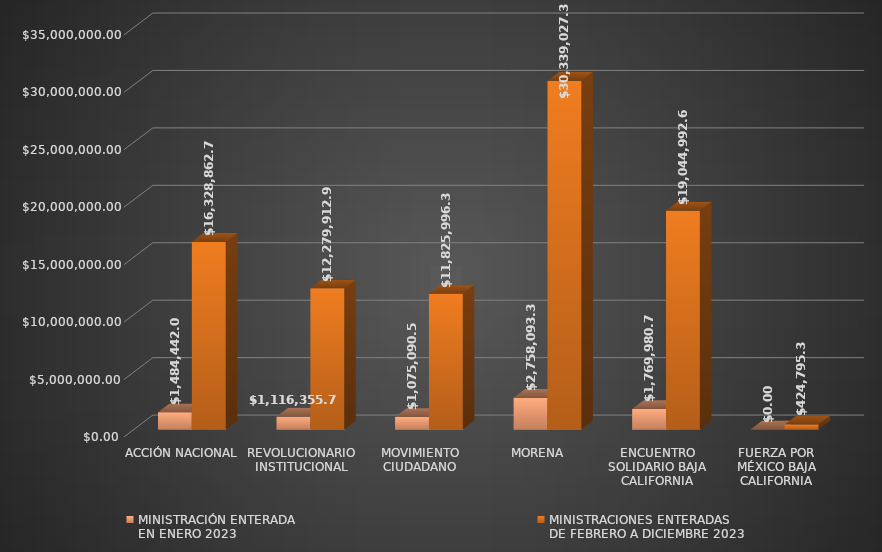
| Category | MINISTRACIÓN ENTERADA
EN ENERO 2023 | MINISTRACIONES ENTERADAS 
DE FEBRERO A DICIEMBRE 2023 |
|---|---|---|
| ACCIÓN NACIONAL | 1484442.07 | 16328862.75 |
| REVOLUCIONARIO INSTITUCIONAL | 1116355.72 | 12279912.97 |
| MOVIMIENTO CIUDADANO | 1075090.58 | 11825996.34 |
| MORENA | 2758093.39 | 30339027.3 |
| ENCUENTRO SOLIDARIO BAJA CALIFORNIA | 1769980.73 | 19044992.68 |
| FUERZA POR MÉXICO BAJA CALIFORNIA | 0 | 424795.37 |